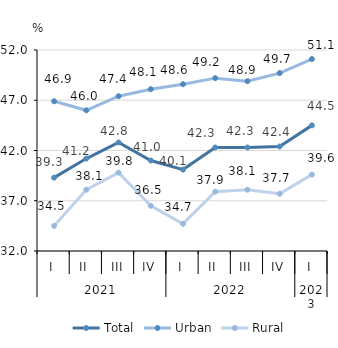
| Category | Total | Urban | Rural |
|---|---|---|---|
| 0 | 39.3 | 46.9 | 34.5 |
| 1 | 41.2 | 46 | 38.1 |
| 2 | 42.8 | 47.4 | 39.8 |
| 3 | 41 | 48.1 | 36.5 |
| 4 | 40.1 | 48.6 | 34.7 |
| 5 | 42.3 | 49.2 | 37.9 |
| 6 | 42.3 | 48.9 | 38.1 |
| 7 | 42.4 | 49.7 | 37.7 |
| 8 | 44.5 | 51.1 | 39.6 |